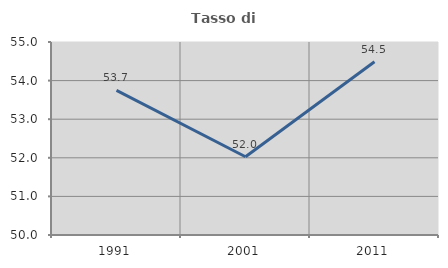
| Category | Tasso di occupazione   |
|---|---|
| 1991.0 | 53.747 |
| 2001.0 | 52.026 |
| 2011.0 | 54.49 |